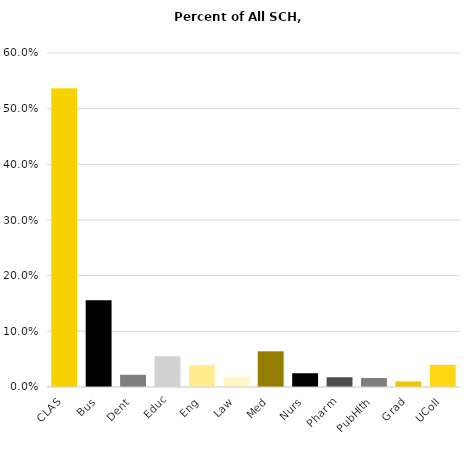
| Category | Series 0 |
|---|---|
| CLAS | 0.537 |
| Bus | 0.156 |
| Dent | 0.022 |
| Educ | 0.055 |
| Eng | 0.039 |
| Law | 0.019 |
| Med | 0.064 |
| Nurs | 0.025 |
| Pharm | 0.018 |
| PubHlth | 0.016 |
| Grad | 0.01 |
| UColl | 0.04 |